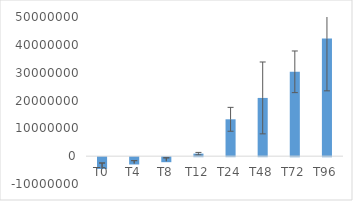
| Category | Series 0 |
|---|---|
| T0 | -4227389.658 |
| T4 | -2626052.226 |
| T8 | -1803095.429 |
| T12 | 911089.678 |
| T24 | 13246447.835 |
| T48 | 20926880.206 |
| T72 | 30309824.195 |
| T96 | 42251409.914 |